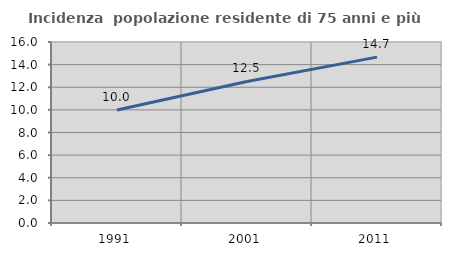
| Category | Incidenza  popolazione residente di 75 anni e più |
|---|---|
| 1991.0 | 9.993 |
| 2001.0 | 12.51 |
| 2011.0 | 14.662 |